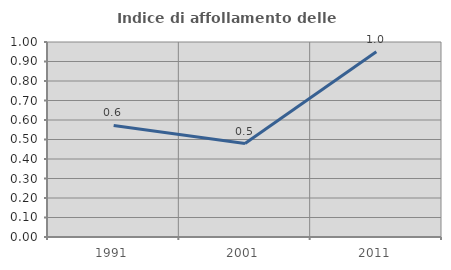
| Category | Indice di affollamento delle abitazioni  |
|---|---|
| 1991.0 | 0.572 |
| 2001.0 | 0.479 |
| 2011.0 | 0.95 |